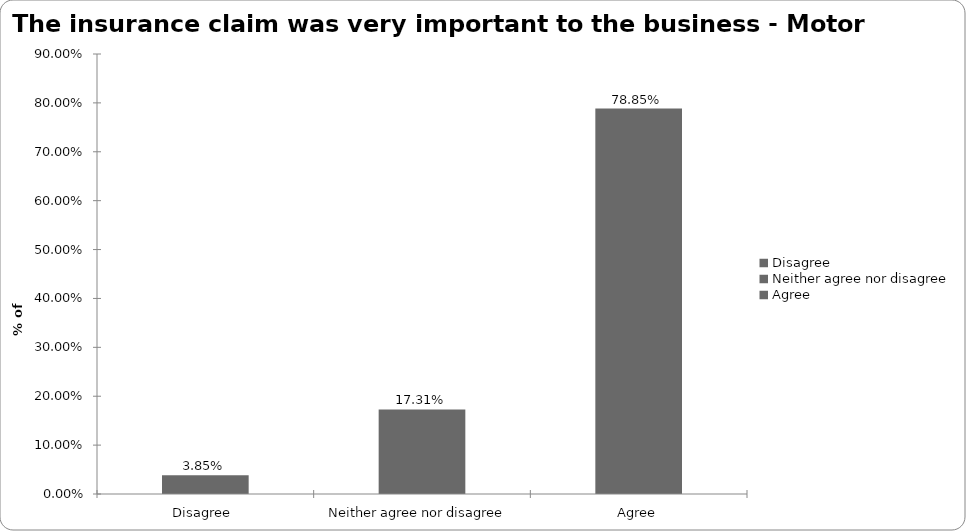
| Category | Motor |
|---|---|
| Disagree  | 0.038 |
| Neither agree nor disagree  | 0.173 |
| Agree | 0.788 |